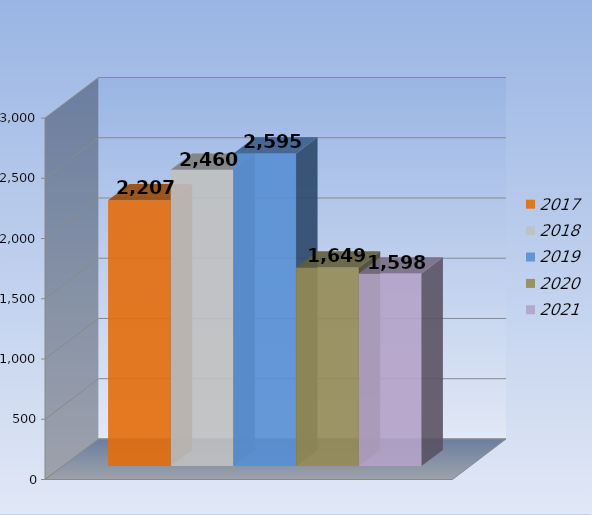
| Category | 2017 | 2018 | 2019 | 2020 | 2021 |
|---|---|---|---|---|---|
| 0 | 2207 | 2460 | 2595 | 1649 | 1598 |